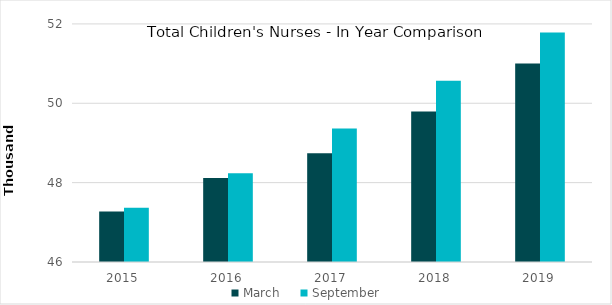
| Category | March | September |
|---|---|---|
| 2015.0 | 47270 | 47370 |
| 2016.0 | 48116 | 48238 |
| 2017.0 | 48742 | 49365 |
| 2018.0 | 49793 | 50565 |
| 2019.0 | 51005 | 51783 |